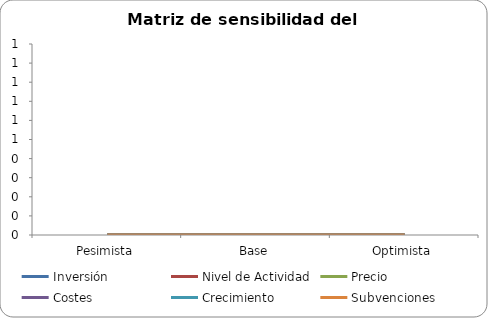
| Category | Inversión | Nivel de Actividad | Precio | Costes | Crecimiento | Subvenciones |
|---|---|---|---|---|---|---|
| Pesimista | 0 | 0 | 0 | 0 | 0 | 0 |
| Base | 0 | 0 | 0 | 0 | 0 | 0 |
| Optimista | 0 | 0 | 0 | 0 | 0 | 0 |